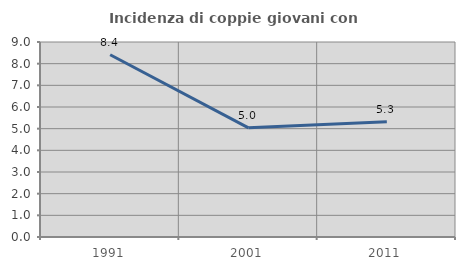
| Category | Incidenza di coppie giovani con figli |
|---|---|
| 1991.0 | 8.413 |
| 2001.0 | 5.04 |
| 2011.0 | 5.316 |